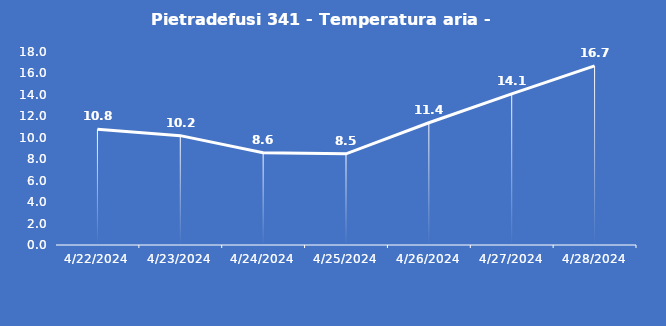
| Category | Pietradefusi 341 - Temperatura aria - Grezzo (°C) |
|---|---|
| 4/22/24 | 10.8 |
| 4/23/24 | 10.2 |
| 4/24/24 | 8.6 |
| 4/25/24 | 8.5 |
| 4/26/24 | 11.4 |
| 4/27/24 | 14.1 |
| 4/28/24 | 16.7 |